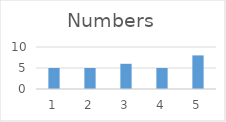
| Category | Numbers |
|---|---|
| 0 | 5 |
| 1 | 5 |
| 2 | 6 |
| 3 | 5 |
| 4 | 8 |